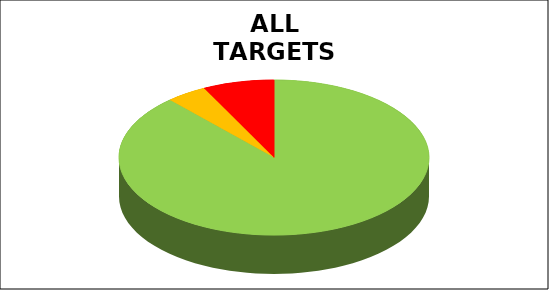
| Category | Series 0 |
|---|---|
| Green | 0.883 |
| Amber | 0.043 |
| Red | 0.074 |